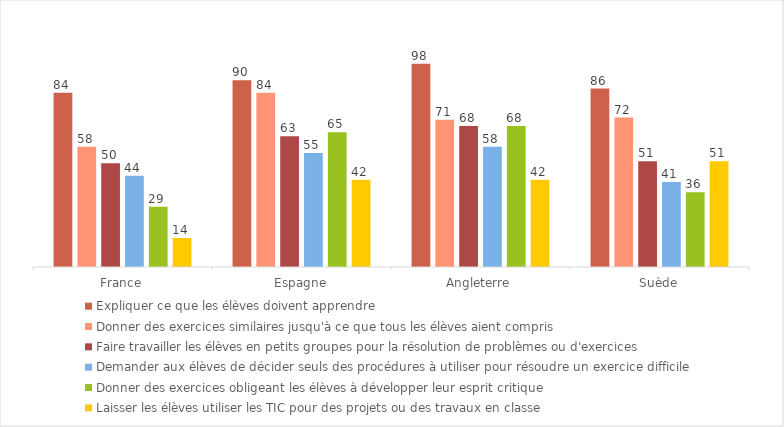
| Category | Expliquer ce que les élèves doivent apprendre | Donner des exercices similaires jusqu'à ce que tous les élèves aient compris | Faire travailler les élèves en petits groupes pour la résolution de problèmes ou d'exercices | Demander aux élèves de décider seuls des procédures à utiliser pour résoudre un exercice difficile | Donner des exercices obligeant les élèves à développer leur esprit critique | Laisser les élèves utiliser les TIC pour des projets ou des travaux en classe |
|---|---|---|---|---|---|---|
| France | 84 | 58 | 50 | 44 | 29 | 14 |
| Espagne | 90 | 84 | 63 | 55 | 65 | 42 |
| Angleterre | 98 | 71 | 68 | 58 | 68 | 42 |
| Suède | 86 | 72 | 51 | 41 | 36 | 51 |